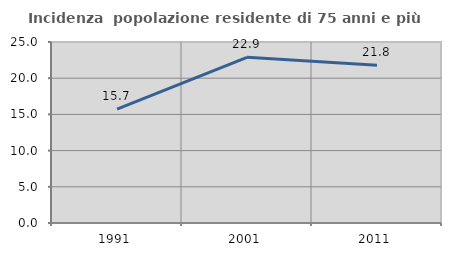
| Category | Incidenza  popolazione residente di 75 anni e più |
|---|---|
| 1991.0 | 15.723 |
| 2001.0 | 22.887 |
| 2011.0 | 21.805 |